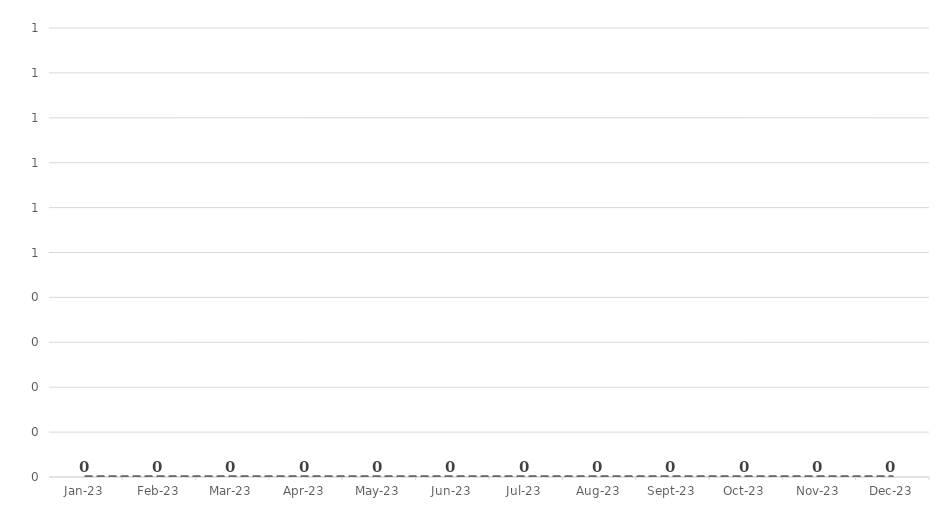
| Category | How big is your gap? |
|---|---|
| 2023-01-01 | 0 |
| 2023-02-01 | 0 |
| 2023-03-01 | 0 |
| 2023-04-01 | 0 |
| 2023-05-01 | 0 |
| 2023-06-01 | 0 |
| 2023-07-01 | 0 |
| 2023-08-01 | 0 |
| 2023-09-01 | 0 |
| 2023-10-01 | 0 |
| 2023-11-01 | 0 |
| 2023-12-01 | 0 |